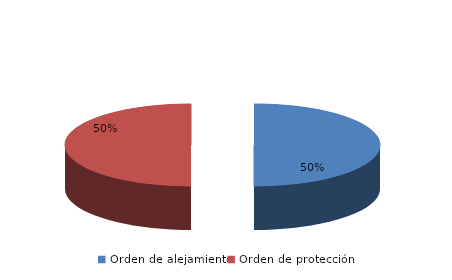
| Category | Series 0 |
|---|---|
| Orden de alejamiento | 435 |
| Orden de protección | 435 |